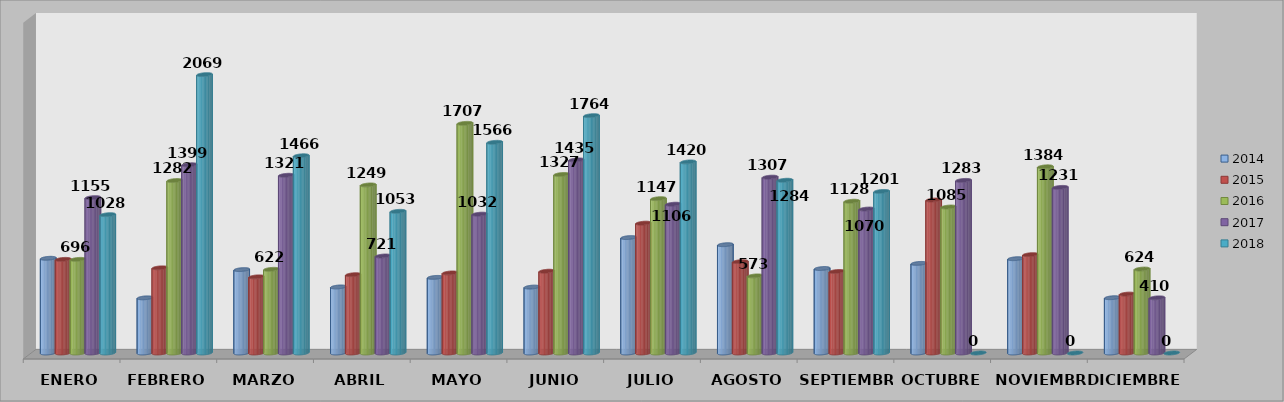
| Category | 2014 | 2015 | 2016 | 2017 | 2018 |
|---|---|---|---|---|---|
| ENERO | 704 | 696 | 696 | 1155 | 1028 |
| FEBRERO | 410 | 633 | 1282 | 1399 | 2069 |
| MARZO | 620 | 566 | 622 | 1321 | 1466 |
| ABRIL | 491 | 582 | 1249 | 721 | 1053 |
| MAYO | 562 | 595 | 1707 | 1032 | 1566 |
| JUNIO | 490 | 608 | 1327 | 1435 | 1764 |
| JULIO | 858 | 965 | 1147 | 1106 | 1420 |
| AGOSTO | 805 | 679 | 573 | 1307 | 1284 |
| SEPTIEMBRE | 628 | 606 | 1128 | 1070 | 1201 |
| OCTUBRE | 666 | 1137 | 1085 | 1283 | 0 |
| NOVIEMBRE | 701 | 731 | 1384 | 1231 | 0 |
| DICIEMBRE | 411 | 438 | 624 | 410 | 0 |